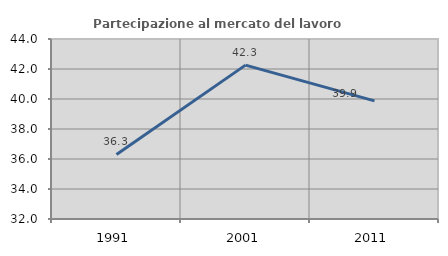
| Category | Partecipazione al mercato del lavoro  femminile |
|---|---|
| 1991.0 | 36.303 |
| 2001.0 | 42.258 |
| 2011.0 | 39.875 |